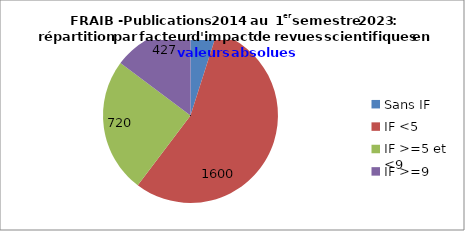
| Category | Series 0 |
|---|---|
| Sans IF | 142 |
| IF <5 | 1600 |
| IF >=5 et <9  | 720 |
| IF >=9 | 427 |